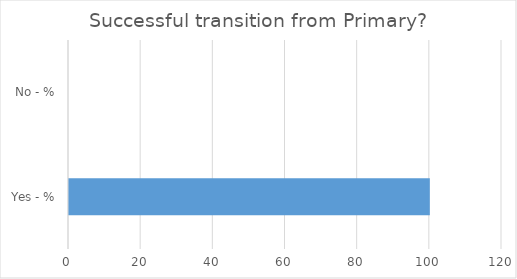
| Category | Series 0 |
|---|---|
| Yes - % | 100 |
| No - % | 0 |